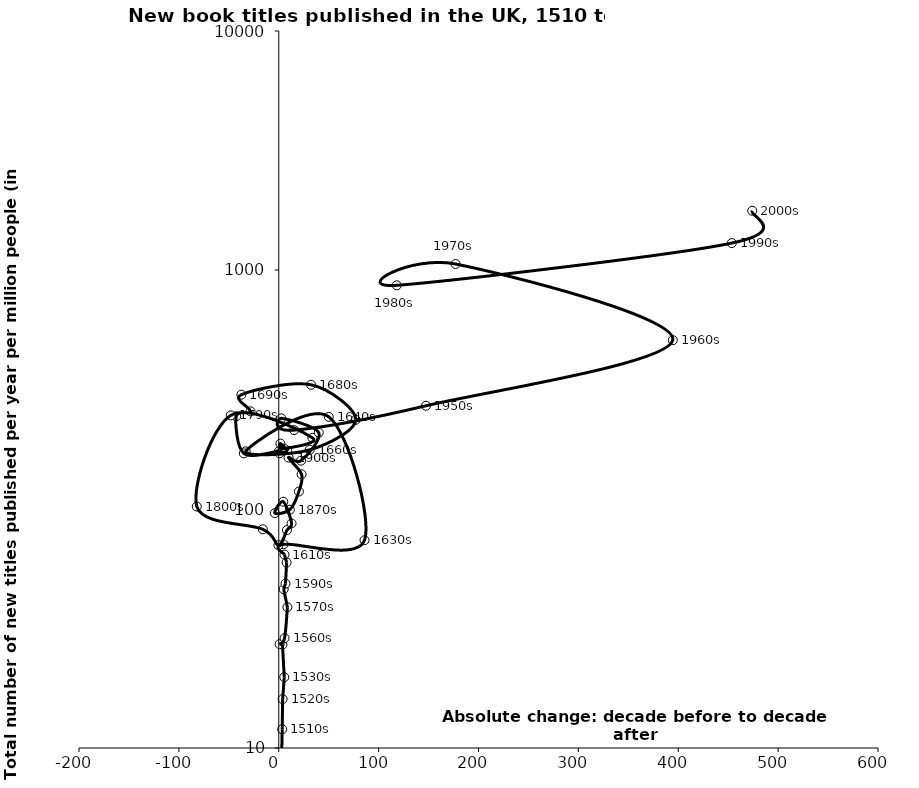
| Category | Series 0 |
|---|---|
| 2.8593682485516823 | 9.114 |
| 3.451525861902083 | 11.973 |
| 3.9029824254037964 | 16.017 |
| 5.530191463458202 | 19.779 |
| 3.7076349793134824 | 27.077 |
| 0.8685803371578729 | 27.195 |
| 5.817163253189891 | 28.815 |
| 8.681691345696926 | 38.829 |
| 4.936506599403568 | 46.178 |
| 6.76753564042118 | 48.702 |
| 7.873496820433811 | 59.713 |
| 5.730284567653936 | 64.449 |
| 4.801614751010305 | 71.174 |
| 85.89963912846056 | 74.052 |
| 50.081892414600006 | 242.973 |
| -33.0832021756101 | 174.216 |
| 30.948760044209877 | 176.807 |
| 77.04017059433855 | 236.114 |
| 32.34625968864188 | 330.887 |
| -37.42934582505157 | 300.806 |
| -28.231930921603464 | 256.028 |
| -42.54809434707741 | 244.342 |
| -35.00182305607112 | 170.932 |
| 0.0998446016019301 | 174.339 |
| 0.6832256784910413 | 171.132 |
| 8.359539041345315 | 175.705 |
| 1.6067778759934157 | 187.851 |
| 5.321666573375893 | 178.919 |
| 33.732248172341826 | 198.494 |
| -48.0438307809966 | 246.383 |
| -82.07098090549137 | 102.406 |
| -15.903546358410537 | 82.241 |
| -0.32149185738304453 | 70.599 |
| 8.203992691491429 | 81.598 |
| 12.828036549698183 | 87.007 |
| 4.551933761352792 | 107.254 |
| -3.9413625644599577 | 96.111 |
| 11.122601713841654 | 99.371 |
| 20.182198117966095 | 118.356 |
| 22.862697177328208 | 139.736 |
| 9.806141998186703 | 164.082 |
| 22.320739405932244 | 159.348 |
| 40.09664361287339 | 208.723 |
| 2.5604085623037207 | 239.541 |
| 15.421685142800499 | 213.844 |
| 147.4273081125836 | 270.385 |
| 394.58020572902586 | 508.699 |
| 177.03067908277214 | 1059.545 |
| 118.17112450299749 | 862.76 |
| 453.61471272804454 | 1295.887 |
| 474.1020594561371 | 1769.989 |